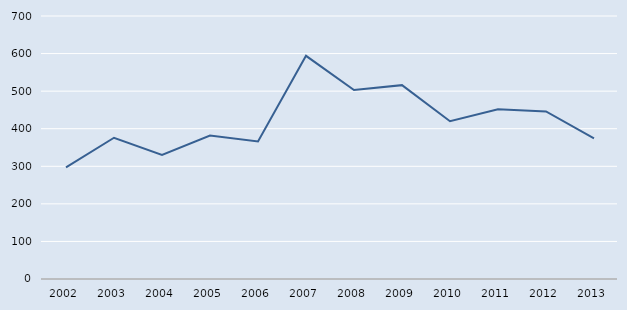
| Category | Series 0 |
|---|---|
| 2002.0 | 297 |
| 2003.0 | 376 |
| 2004.0 | 330 |
| 2005.0 | 382 |
| 2006.0 | 366 |
| 2007.0 | 594 |
| 2008.0 | 503 |
| 2009.0 | 516 |
| 2010.0 | 420 |
| 2011.0 | 452 |
| 2012.0 | 446 |
| 2013.0 | 374 |